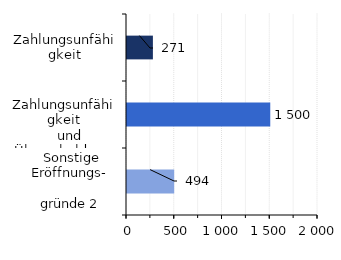
| Category | Series 0 |
|---|---|
| Zahlungsunfähigkeit | 271.223 |
|   Zahlungsunfähigkeit
   und Überschuldung | 1500.09 |
|  Sonstige Eröffnungs-
                      gründe 2 | 494.2 |